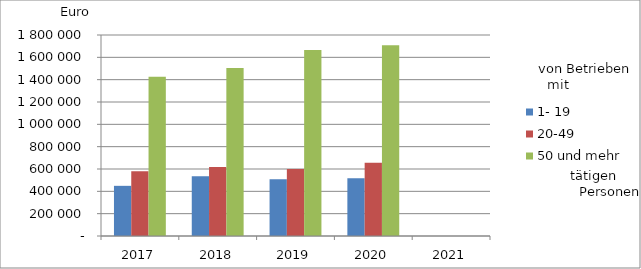
| Category | 1- 19 | 20-49 | 50 und mehr |
|---|---|---|---|
| 2017.0 | 449238.155 | 579413.351 | 1425932.487 |
| 2018.0 | 536024.379 | 617872.882 | 1504659.932 |
| 2019.0 | 508788.577 | 600739.035 | 1666354.201 |
| 2020.0 | 517241.437 | 654868.01 | 1708607.175 |
| 2021.0 | 0 | 0 | 0 |